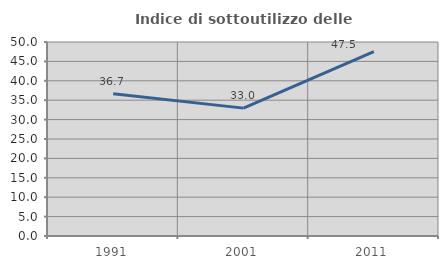
| Category | Indice di sottoutilizzo delle abitazioni  |
|---|---|
| 1991.0 | 36.667 |
| 2001.0 | 32.96 |
| 2011.0 | 47.531 |